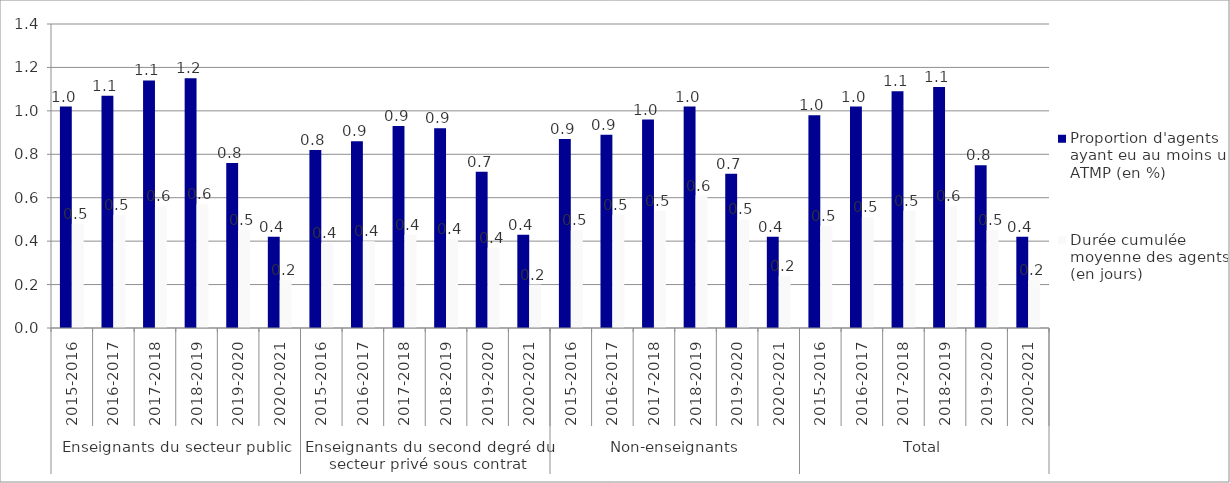
| Category | Proportion d'agents ayant eu au moins un ATMP (en %) | Durée cumulée moyenne des agents (en jours) |
|---|---|---|
| 0 | 1.02 | 0.48 |
| 1 | 1.07 | 0.52 |
| 2 | 1.14 | 0.56 |
| 3 | 1.15 | 0.57 |
| 4 | 0.76 | 0.45 |
| 5 | 0.42 | 0.22 |
| 6 | 0.82 | 0.39 |
| 7 | 0.86 | 0.4 |
| 8 | 0.93 | 0.43 |
| 9 | 0.92 | 0.41 |
| 10 | 0.72 | 0.37 |
| 11 | 0.43 | 0.2 |
| 12 | 0.87 | 0.45 |
| 13 | 0.89 | 0.52 |
| 14 | 0.96 | 0.54 |
| 15 | 1.02 | 0.61 |
| 16 | 0.71 | 0.5 |
| 17 | 0.42 | 0.24 |
| 18 | 0.98 | 0.47 |
| 19 | 1.02 | 0.51 |
| 20 | 1.09 | 0.54 |
| 21 | 1.11 | 0.56 |
| 22 | 0.75 | 0.45 |
| 23 | 0.42 | 0.22 |